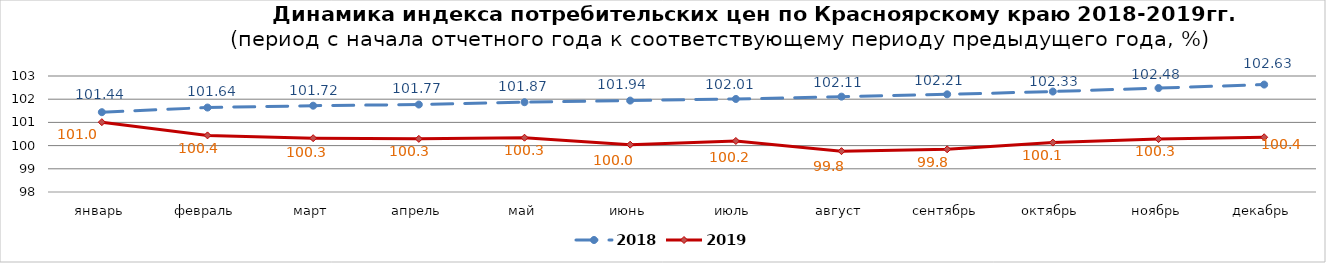
| Category | 2018 | 2019 |
|---|---|---|
| январь | 101.44 | 101.01 |
| февраль | 101.64 | 100.44 |
| март | 101.72 | 100.32 |
| апрель | 101.77 | 100.29 |
| май | 101.87 | 100.34 |
| июнь | 101.94 | 100.04 |
| июль | 102.01 | 100.2 |
| август | 102.11 | 99.76 |
| сентябрь | 102.21 | 99.84 |
| октябрь | 102.33 | 100.13 |
| ноябрь | 102.48 | 100.28 |
| декабрь | 102.63 | 100.36 |